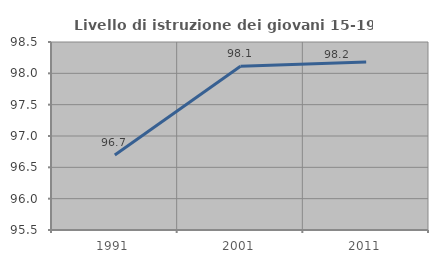
| Category | Livello di istruzione dei giovani 15-19 anni |
|---|---|
| 1991.0 | 96.698 |
| 2001.0 | 98.113 |
| 2011.0 | 98.182 |